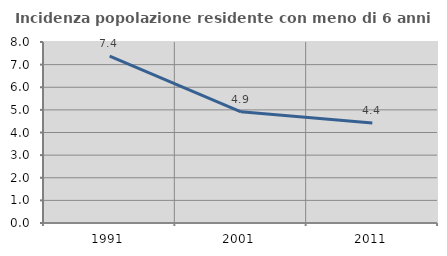
| Category | Incidenza popolazione residente con meno di 6 anni |
|---|---|
| 1991.0 | 7.372 |
| 2001.0 | 4.915 |
| 2011.0 | 4.423 |